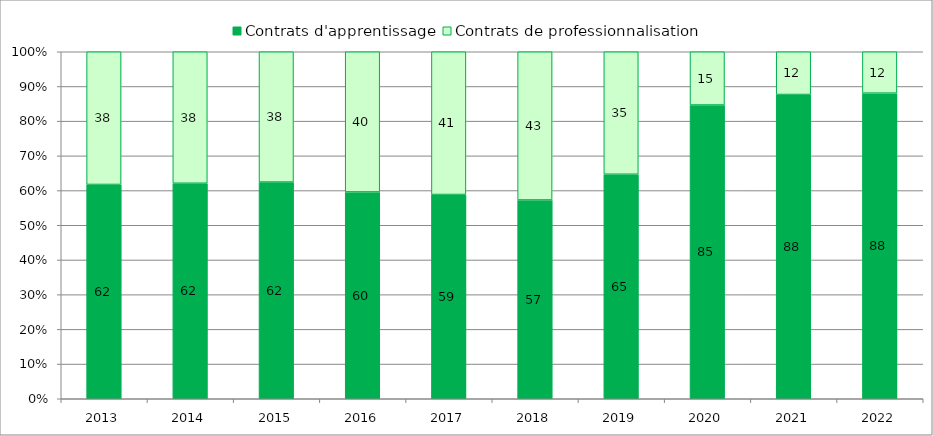
| Category | Contrats d'apprentissage | Contrats de professionnalisation |
|---|---|---|
| 2013.0 | 61.759 | 38.241 |
| 2014.0 | 62.1 | 37.9 |
| 2015.0 | 62.451 | 37.549 |
| 2016.0 | 59.609 | 40.391 |
| 2017.0 | 58.86 | 41.14 |
| 2018.0 | 57.292 | 42.708 |
| 2019.0 | 64.707 | 35.293 |
| 2020.0 | 84.658 | 15.342 |
| 2021.0 | 87.679 | 12.321 |
| 2022.0 | 88.074 | 11.926 |